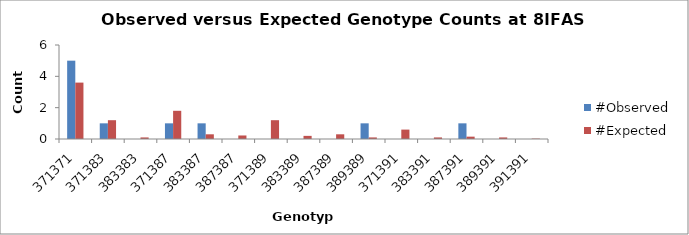
| Category | #Observed | #Expected |
|---|---|---|
| 371371.0 | 5 | 3.6 |
| 371383.0 | 1 | 1.2 |
| 383383.0 | 0 | 0.1 |
| 371387.0 | 1 | 1.8 |
| 383387.0 | 1 | 0.3 |
| 387387.0 | 0 | 0.225 |
| 371389.0 | 0 | 1.2 |
| 383389.0 | 0 | 0.2 |
| 387389.0 | 0 | 0.3 |
| 389389.0 | 1 | 0.1 |
| 371391.0 | 0 | 0.6 |
| 383391.0 | 0 | 0.1 |
| 387391.0 | 1 | 0.15 |
| 389391.0 | 0 | 0.1 |
| 391391.0 | 0 | 0.025 |